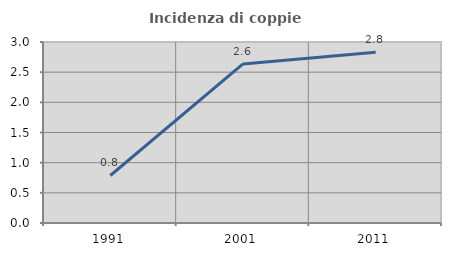
| Category | Incidenza di coppie miste |
|---|---|
| 1991.0 | 0.787 |
| 2001.0 | 2.637 |
| 2011.0 | 2.829 |